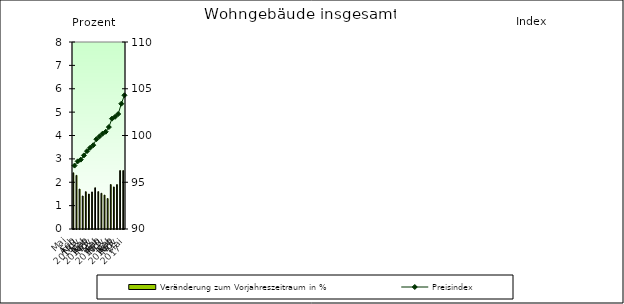
| Category | Veränderung zum Vorjahreszeitraum in % |
|---|---|
| 0 | 2.404 |
| 1 | 2.294 |
| 2 | 1.708 |
| 3 | 1.412 |
| 4 | 1.596 |
| 5 | 1.495 |
| 6 | 1.586 |
| 7 | 1.764 |
| 8 | 1.599 |
| 9 | 1.529 |
| 10 | 1.451 |
| 11 | 1.305 |
| 12 | 1.902 |
| 13 | 1.8 |
| 14 | 1.9 |
| 15 | 2.5 |
| 16 | 2.5 |